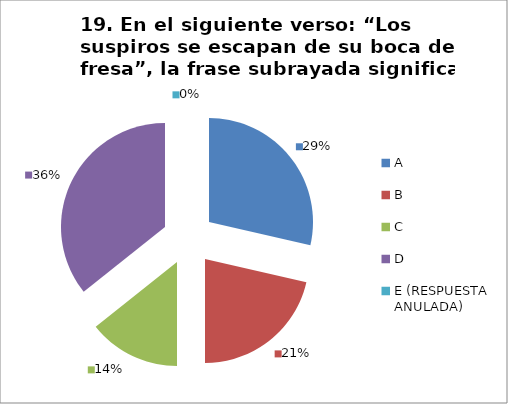
| Category | CANTIDAD DE RESPUESTAS PREGUNTA (19) | PORCENTAJE |
|---|---|---|
| A | 8 | 0.286 |
| B | 6 | 0.214 |
| C | 4 | 0.143 |
| D | 10 | 0.357 |
| E (RESPUESTA ANULADA) | 0 | 0 |